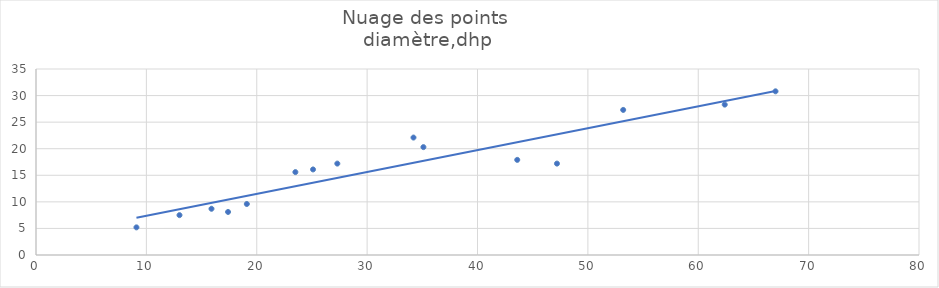
| Category | Series 0 |
|---|---|
| 25.1 | 16.1 |
| 23.5 | 15.6 |
| 34.2 | 22.1 |
| 35.1 | 20.3 |
| 43.6 | 17.9 |
| 15.9 | 8.7 |
| 62.4 | 28.3 |
| 67.0 | 30.8 |
| 9.1 | 5.2 |
| 19.1 | 9.6 |
| 13.0 | 7.5 |
| 53.2 | 27.3 |
| 47.2 | 17.2 |
| 17.4 | 8.1 |
| 27.3 | 17.2 |